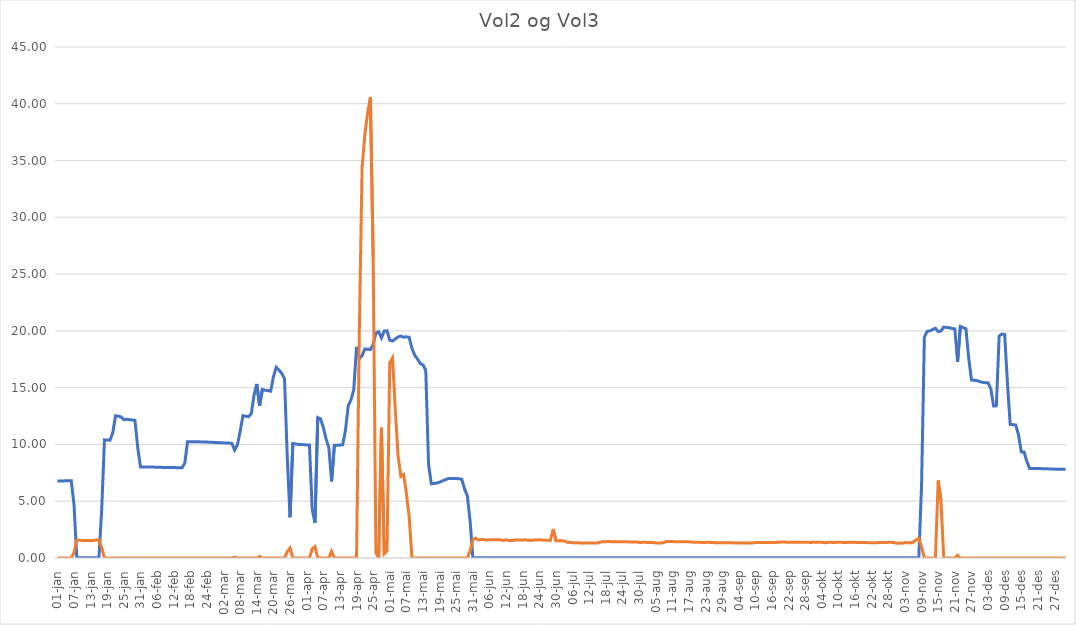
| Category | Gjennomsnitt av vol2 | Gjennomsnitt av vol3 |
|---|---|---|
| 01-jan | 6.791 | 0 |
| 02-jan | 6.785 | 0 |
| 03-jan | 6.786 | 0 |
| 04-jan | 6.798 | 0 |
| 05-jan | 6.808 | 0 |
| 06-jan | 6.813 | 0 |
| 07-jan | 4.713 | 0.478 |
| 08-jan | 0.03 | 1.565 |
| 09-jan | 0.03 | 1.579 |
| 10-jan | 0.03 | 1.52 |
| 11-jan | 0.03 | 1.539 |
| 12-jan | 0.027 | 1.54 |
| 13-jan | 0.023 | 1.525 |
| 14-jan | 0.023 | 1.544 |
| 15-jan | 0.022 | 1.581 |
| 16-jan | 0.022 | 1.601 |
| 17-jan | 4.291 | 0.913 |
| 18-jan | 10.402 | 0 |
| 19-jan | 10.385 | 0 |
| 20-jan | 10.373 | 0 |
| 21-jan | 11.039 | 0 |
| 22-jan | 12.522 | 0 |
| 23-jan | 12.492 | 0 |
| 24-jan | 12.429 | 0 |
| 25-jan | 12.178 | 0 |
| 26-jan | 12.217 | 0 |
| 27-jan | 12.181 | 0 |
| 28-jan | 12.156 | 0 |
| 29-jan | 12.12 | 0 |
| 30-jan | 9.747 | 0 |
| 31-jan | 8.018 | 0 |
| 01-feb | 8.016 | 0 |
| 02-feb | 8.018 | 0 |
| 03-feb | 8.012 | 0 |
| 04-feb | 8.004 | 0 |
| 05-feb | 8.003 | 0 |
| 06-feb | 7.998 | 0 |
| 07-feb | 7.988 | 0 |
| 08-feb | 7.979 | 0 |
| 09-feb | 7.976 | 0 |
| 10-feb | 7.97 | 0 |
| 11-feb | 7.97 | 0 |
| 12-feb | 7.964 | 0 |
| 13-feb | 7.958 | 0 |
| 14-feb | 7.954 | 0 |
| 15-feb | 7.942 | 0 |
| 16-feb | 8.36 | 0 |
| 17-feb | 10.243 | 0 |
| 18-feb | 10.246 | 0 |
| 19-feb | 10.242 | 0 |
| 20-feb | 10.244 | 0 |
| 21-feb | 10.233 | 0 |
| 22-feb | 10.222 | 0 |
| 23-feb | 10.211 | 0 |
| 24-feb | 10.211 | 0 |
| 25-feb | 10.198 | 0 |
| 26-feb | 10.186 | 0 |
| 27-feb | 10.176 | 0 |
| 28-feb | 10.155 | 0 |
| 01-mar | 10.153 | 0 |
| 02-mar | 10.144 | 0 |
| 03-mar | 10.127 | 0 |
| 04-mar | 10.116 | 0 |
| 05-mar | 10.093 | 0 |
| 06-mar | 9.51 | 0.072 |
| 07-mar | 9.974 | 0 |
| 08-mar | 11.182 | 0 |
| 09-mar | 12.536 | 0 |
| 10-mar | 12.487 | 0 |
| 11-mar | 12.447 | 0 |
| 12-mar | 12.713 | 0 |
| 13-mar | 14.352 | 0 |
| 14-mar | 15.327 | 0 |
| 15-mar | 13.396 | 0.138 |
| 16-mar | 14.844 | 0 |
| 17-mar | 14.78 | 0 |
| 18-mar | 14.747 | 0 |
| 19-mar | 14.695 | 0 |
| 20-mar | 15.958 | 0 |
| 21-mar | 16.795 | 0 |
| 22-mar | 16.551 | 0 |
| 23-mar | 16.268 | 0 |
| 24-mar | 15.79 | 0 |
| 25-mar | 8.843 | 0.556 |
| 26-mar | 3.588 | 0.889 |
| 27-mar | 10.082 | 0 |
| 28-mar | 10.048 | 0 |
| 29-mar | 10.003 | 0 |
| 30-mar | 9.999 | 0 |
| 31-mar | 9.979 | 0 |
| 01-apr | 9.958 | 0 |
| 02-apr | 9.948 | 0 |
| 03-apr | 4.281 | 0.803 |
| 04-apr | 3.094 | 1 |
| 05-apr | 12.368 | 0 |
| 06-apr | 12.248 | 0 |
| 07-apr | 11.501 | 0 |
| 08-apr | 10.491 | 0 |
| 09-apr | 9.72 | 0 |
| 10-apr | 6.753 | 0.588 |
| 11-apr | 9.928 | 0 |
| 12-apr | 9.934 | 0 |
| 13-apr | 9.955 | 0 |
| 14-apr | 9.968 | 0 |
| 15-apr | 11.245 | 0 |
| 16-apr | 13.404 | 0 |
| 17-apr | 13.931 | 0 |
| 18-apr | 14.827 | 0 |
| 19-apr | 18.584 | 0 |
| 20-apr | 17.553 | 19.801 |
| 21-apr | 17.825 | 34.376 |
| 22-apr | 18.402 | 37.283 |
| 23-apr | 18.38 | 39.187 |
| 24-apr | 18.362 | 40.579 |
| 25-apr | 18.819 | 26.508 |
| 26-apr | 19.809 | 0.452 |
| 27-apr | 19.926 | 0 |
| 28-apr | 19.383 | 11.468 |
| 29-apr | 19.988 | 0.362 |
| 30-apr | 20.006 | 0.614 |
| 01-mai | 19.177 | 17.199 |
| 02-mai | 19.111 | 17.619 |
| 03-mai | 19.289 | 13.002 |
| 04-mai | 19.469 | 8.981 |
| 05-mai | 19.537 | 7.181 |
| 06-mai | 19.44 | 7.354 |
| 07-mai | 19.481 | 5.701 |
| 08-mai | 19.437 | 3.647 |
| 09-mai | 18.461 | 0 |
| 10-mai | 17.862 | 0 |
| 11-mai | 17.53 | 0 |
| 12-mai | 17.127 | 0 |
| 13-mai | 17 | 0 |
| 14-mai | 16.529 | 0 |
| 15-mai | 8.25 | 0 |
| 16-mai | 6.543 | 0 |
| 17-mai | 6.554 | 0 |
| 18-mai | 6.613 | 0 |
| 19-mai | 6.669 | 0 |
| 20-mai | 6.793 | 0 |
| 21-mai | 6.877 | 0 |
| 22-mai | 6.99 | 0 |
| 23-mai | 6.999 | 0 |
| 24-mai | 6.993 | 0 |
| 25-mai | 7.003 | 0 |
| 26-mai | 6.978 | 0 |
| 27-mai | 6.93 | 0 |
| 28-mai | 6.083 | 0 |
| 29-mai | 5.48 | 0 |
| 30-mai | 3.259 | 0.627 |
| 31-mai | 0.02 | 1.612 |
| 01-jun | 0.02 | 1.752 |
| 02-jun | 0.02 | 1.578 |
| 03-jun | 0.02 | 1.627 |
| 04-jun | 0.021 | 1.618 |
| 05-jun | 0.027 | 1.576 |
| 06-jun | 0.027 | 1.601 |
| 07-jun | 0.025 | 1.608 |
| 08-jun | 0.025 | 1.609 |
| 09-jun | 0.026 | 1.6 |
| 10-jun | 0.027 | 1.595 |
| 11-jun | 0.03 | 1.548 |
| 12-jun | 0.03 | 1.594 |
| 13-jun | 0.03 | 1.557 |
| 14-jun | 0.03 | 1.528 |
| 15-jun | 0.03 | 1.575 |
| 16-jun | 0.03 | 1.597 |
| 17-jun | 0.03 | 1.586 |
| 18-jun | 0.03 | 1.585 |
| 19-jun | 0.03 | 1.597 |
| 20-jun | 0.03 | 1.563 |
| 21-jun | 0.03 | 1.545 |
| 22-jun | 0.03 | 1.592 |
| 23-jun | 0.03 | 1.586 |
| 24-jun | 0.03 | 1.605 |
| 25-jun | 0.03 | 1.578 |
| 26-jun | 0.03 | 1.568 |
| 27-jun | 0.03 | 1.55 |
| 28-jun | 0.03 | 1.561 |
| 29-jun | 0.03 | 2.554 |
| 30-jun | 0.03 | 1.522 |
| 01-jul | 0.03 | 1.527 |
| 02-jul | 0.029 | 1.524 |
| 03-jul | 0.027 | 1.494 |
| 04-jul | 0.027 | 1.392 |
| 05-jul | 0.026 | 1.367 |
| 06-jul | 0.028 | 1.348 |
| 07-jul | 0.03 | 1.349 |
| 08-jul | 0.029 | 1.339 |
| 09-jul | 0.029 | 1.32 |
| 10-jul | 0.028 | 1.325 |
| 11-jul | 0.028 | 1.332 |
| 12-jul | 0.029 | 1.324 |
| 13-jul | 0.028 | 1.326 |
| 14-jul | 0.029 | 1.324 |
| 15-jul | 0.03 | 1.319 |
| 16-jul | 0.03 | 1.395 |
| 17-jul | 0.03 | 1.443 |
| 18-jul | 0.03 | 1.439 |
| 19-jul | 0.03 | 1.448 |
| 20-jul | 0.03 | 1.439 |
| 21-jul | 0.03 | 1.433 |
| 22-jul | 0.03 | 1.431 |
| 23-jul | 0.03 | 1.418 |
| 24-jul | 0.03 | 1.426 |
| 25-jul | 0.029 | 1.423 |
| 26-jul | 0.029 | 1.42 |
| 27-jul | 0.029 | 1.414 |
| 28-jul | 0.029 | 1.402 |
| 29-jul | 0.029 | 1.416 |
| 30-jul | 0.028 | 1.376 |
| 31-jul | 0.028 | 1.375 |
| 01-aug | 0.028 | 1.388 |
| 02-aug | 0.028 | 1.368 |
| 03-aug | 0.027 | 1.358 |
| 04-aug | 0.027 | 1.357 |
| 05-aug | 0.026 | 1.334 |
| 06-aug | 0.025 | 1.313 |
| 07-aug | 0.024 | 1.321 |
| 08-aug | 0.025 | 1.365 |
| 09-aug | 0.028 | 1.46 |
| 10-aug | 0.029 | 1.444 |
| 11-aug | 0.03 | 1.452 |
| 12-aug | 0.03 | 1.432 |
| 13-aug | 0.03 | 1.434 |
| 14-aug | 0.03 | 1.431 |
| 15-aug | 0.03 | 1.421 |
| 16-aug | 0.03 | 1.42 |
| 17-aug | 0.03 | 1.425 |
| 18-aug | 0.03 | 1.4 |
| 19-aug | 0.03 | 1.396 |
| 20-aug | 0.03 | 1.383 |
| 21-aug | 0.03 | 1.383 |
| 22-aug | 0.03 | 1.366 |
| 23-aug | 0.03 | 1.375 |
| 24-aug | 0.03 | 1.379 |
| 25-aug | 0.03 | 1.36 |
| 26-aug | 0.03 | 1.359 |
| 27-aug | 0.03 | 1.331 |
| 28-aug | 0.03 | 1.351 |
| 29-aug | 0.03 | 1.333 |
| 30-aug | 0.03 | 1.35 |
| 31-aug | 0.03 | 1.344 |
| 01-sep | 0.029 | 1.337 |
| 02-sep | 0.029 | 1.331 |
| 03-sep | 0.029 | 1.332 |
| 04-sep | 0.028 | 1.319 |
| 05-sep | 0.028 | 1.333 |
| 06-sep | 0.028 | 1.327 |
| 07-sep | 0.029 | 1.324 |
| 08-sep | 0.029 | 1.329 |
| 09-sep | 0.029 | 1.324 |
| 10-sep | 0.03 | 1.358 |
| 11-sep | 0.03 | 1.367 |
| 12-sep | 0.03 | 1.368 |
| 13-sep | 0.029 | 1.376 |
| 14-sep | 0.029 | 1.374 |
| 15-sep | 0.028 | 1.376 |
| 16-sep | 0.028 | 1.362 |
| 17-sep | 0.028 | 1.364 |
| 18-sep | 0.027 | 1.382 |
| 19-sep | 0.027 | 1.399 |
| 20-sep | 0.027 | 1.404 |
| 21-sep | 0.027 | 1.395 |
| 22-sep | 0.028 | 1.389 |
| 23-sep | 0.027 | 1.393 |
| 24-sep | 0.027 | 1.384 |
| 25-sep | 0.026 | 1.393 |
| 26-sep | 0.023 | 1.377 |
| 27-sep | 0.023 | 1.397 |
| 28-sep | 0.023 | 1.382 |
| 29-sep | 0.025 | 1.383 |
| 30-sep | 0.025 | 1.363 |
| 01-okt | 0.025 | 1.393 |
| 02-okt | 0.026 | 1.398 |
| 03-okt | 0.026 | 1.383 |
| 04-okt | 0.027 | 1.379 |
| 05-okt | 0.026 | 1.348 |
| 06-okt | 0.027 | 1.367 |
| 07-okt | 0.028 | 1.393 |
| 08-okt | 0.028 | 1.351 |
| 09-okt | 0.028 | 1.375 |
| 10-okt | 0.027 | 1.379 |
| 11-okt | 0.028 | 1.38 |
| 12-okt | 0.028 | 1.368 |
| 13-okt | 0.029 | 1.354 |
| 14-okt | 0.029 | 1.388 |
| 15-okt | 0.03 | 1.375 |
| 16-okt | 0.03 | 1.379 |
| 17-okt | 0.03 | 1.363 |
| 18-okt | 0.03 | 1.369 |
| 19-okt | 0.03 | 1.357 |
| 20-okt | 0.03 | 1.355 |
| 21-okt | 0.03 | 1.347 |
| 22-okt | 0.03 | 1.351 |
| 23-okt | 0.03 | 1.336 |
| 24-okt | 0.03 | 1.35 |
| 25-okt | 0.03 | 1.363 |
| 26-okt | 0.03 | 1.368 |
| 27-okt | 0.03 | 1.356 |
| 28-okt | 0.03 | 1.384 |
| 29-okt | 0.03 | 1.379 |
| 30-okt | 0.03 | 1.359 |
| 31-okt | 0.03 | 1.299 |
| 01-nov | 0.03 | 1.313 |
| 02-nov | 0.03 | 1.301 |
| 03-nov | 0.03 | 1.358 |
| 04-nov | 0.03 | 1.341 |
| 05-nov | 0.03 | 1.328 |
| 06-nov | 0.03 | 1.402 |
| 07-nov | 0.03 | 1.588 |
| 08-nov | 0.03 | 1.729 |
| 09-nov | 6.492 | 0.978 |
| 10-nov | 19.442 | 0 |
| 11-nov | 19.961 | 0 |
| 12-nov | 19.997 | 0 |
| 13-nov | 20.128 | 0 |
| 14-nov | 20.23 | 0 |
| 15-nov | 19.943 | 6.825 |
| 16-nov | 19.988 | 5.022 |
| 17-nov | 20.33 | 0 |
| 18-nov | 20.305 | 0 |
| 19-nov | 20.275 | 0 |
| 20-nov | 20.217 | 0 |
| 21-nov | 20.179 | 0 |
| 22-nov | 17.269 | 0.237 |
| 23-nov | 20.396 | 0 |
| 24-nov | 20.287 | 0 |
| 25-nov | 20.201 | 0 |
| 26-nov | 17.628 | 0 |
| 27-nov | 15.681 | 0 |
| 28-nov | 15.652 | 0 |
| 29-nov | 15.625 | 0 |
| 30-nov | 15.533 | 0 |
| 01-des | 15.467 | 0 |
| 02-des | 15.438 | 0 |
| 03-des | 15.437 | 0 |
| 04-des | 14.895 | 0 |
| 05-des | 13.391 | 0 |
| 06-des | 13.396 | 0 |
| 07-des | 19.54 | 0 |
| 08-des | 19.723 | 0 |
| 09-des | 19.684 | 0 |
| 10-des | 15.361 | 0 |
| 11-des | 11.759 | 0 |
| 12-des | 11.743 | 0 |
| 13-des | 11.709 | 0 |
| 14-des | 10.837 | 0 |
| 15-des | 9.347 | 0 |
| 16-des | 9.339 | 0 |
| 17-des | 8.5 | 0 |
| 18-des | 7.884 | 0 |
| 19-des | 7.881 | 0 |
| 20-des | 7.881 | 0 |
| 21-des | 7.877 | 0 |
| 22-des | 7.872 | 0 |
| 23-des | 7.864 | 0 |
| 24-des | 7.854 | 0 |
| 25-des | 7.847 | 0 |
| 26-des | 7.836 | 0 |
| 27-des | 7.826 | 0 |
| 28-des | 7.821 | 0 |
| 29-des | 7.821 | 0 |
| 30-des | 7.81 | 0 |
| 31-des | 7.804 | 0 |